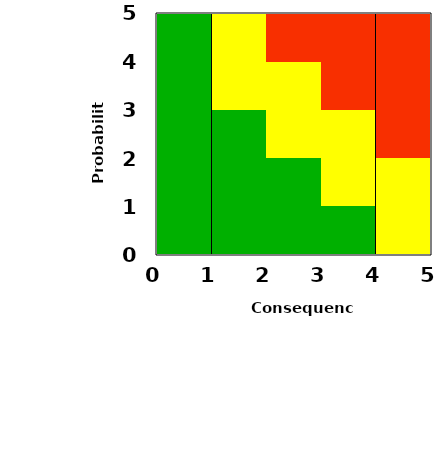
| Category | Series 0 |
|---|---|
| 2.875 | 0 |